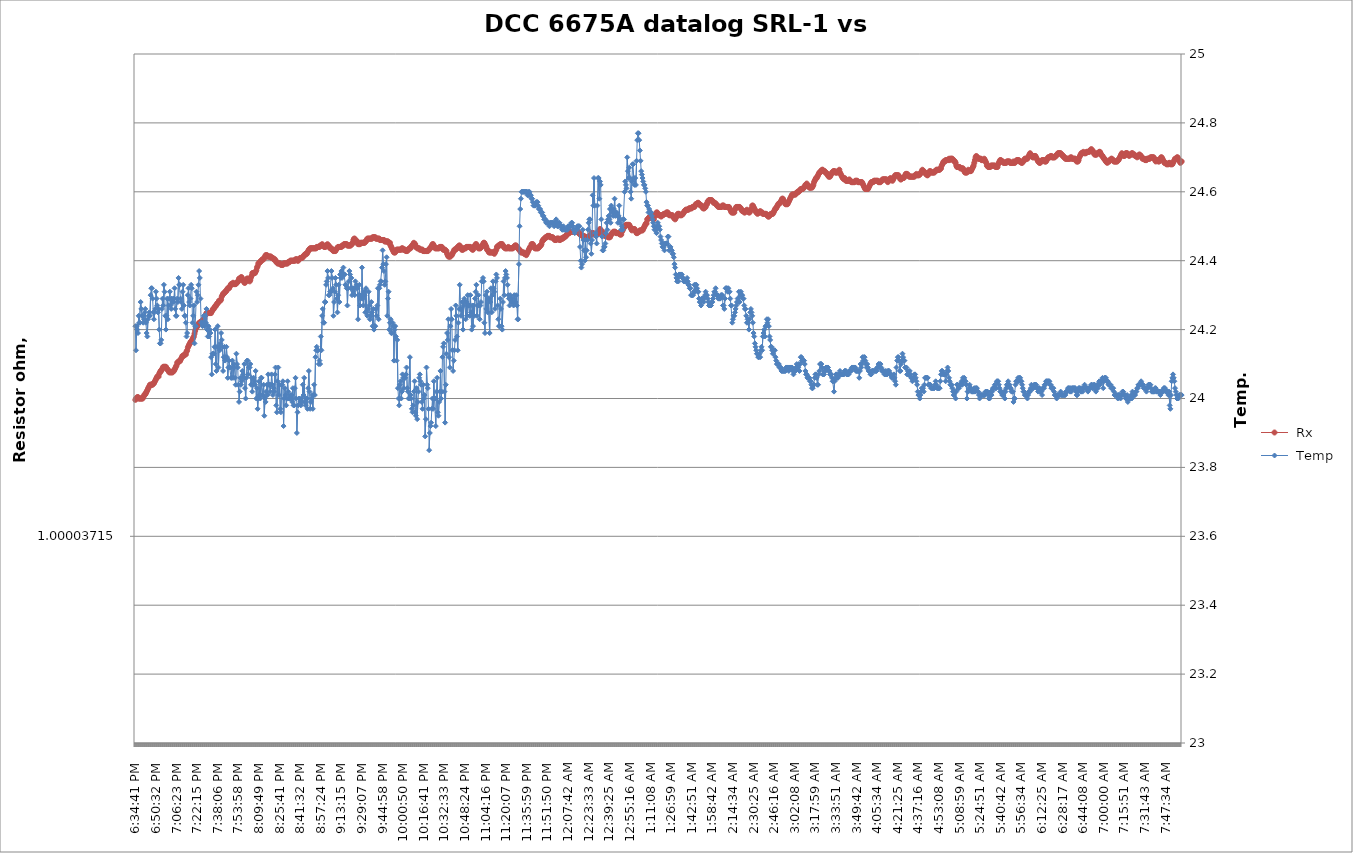
| Category |  Rx |
|---|---|
| 2021-03-14 18:34:41 | 1 |
| 2021-03-14 18:35:11 | 1 |
| 2021-03-14 18:35:42 | 1 |
| 2021-03-14 18:36:13 | 1 |
| 2021-03-14 18:36:43 | 1 |
| 2021-03-14 18:37:14 | 1 |
| 2021-03-14 18:37:45 | 1 |
| 2021-03-14 18:38:15 | 1 |
| 2021-03-14 18:38:46 | 1 |
| 2021-03-14 18:39:17 | 1 |
| 2021-03-14 18:39:47 | 1 |
| 2021-03-14 18:40:18 | 1 |
| 2021-03-14 18:40:49 | 1 |
| 2021-03-14 18:41:20 | 1 |
| 2021-03-14 18:41:50 | 1 |
| 2021-03-14 18:42:21 | 1 |
| 2021-03-14 18:42:52 | 1 |
| 2021-03-14 18:43:22 | 1 |
| 2021-03-14 18:43:53 | 1 |
| 2021-03-14 18:44:24 | 1 |
| 2021-03-14 18:44:54 | 1 |
| 2021-03-14 18:45:25 | 1 |
| 2021-03-14 18:45:56 | 1 |
| 2021-03-14 18:46:26 | 1 |
| 2021-03-14 18:46:57 | 1 |
| 2021-03-14 18:47:28 | 1 |
| 2021-03-14 18:47:59 | 1 |
| 2021-03-14 18:48:29 | 1 |
| 2021-03-14 18:49:00 | 1 |
| 2021-03-14 18:49:31 | 1 |
| 2021-03-14 18:50:01 | 1 |
| 2021-03-14 18:50:32 | 1 |
| 2021-03-14 18:51:03 | 1 |
| 2021-03-14 18:51:33 | 1 |
| 2021-03-14 18:52:04 | 1 |
| 2021-03-14 18:52:35 | 1 |
| 2021-03-14 18:53:05 | 1 |
| 2021-03-14 18:53:36 | 1 |
| 2021-03-14 18:54:07 | 1 |
| 2021-03-14 18:54:38 | 1 |
| 2021-03-14 18:55:08 | 1 |
| 2021-03-14 18:55:39 | 1 |
| 2021-03-14 18:56:10 | 1 |
| 2021-03-14 18:56:40 | 1 |
| 2021-03-14 18:57:11 | 1 |
| 2021-03-14 18:57:42 | 1 |
| 2021-03-14 18:58:12 | 1 |
| 2021-03-14 18:58:43 | 1 |
| 2021-03-14 18:59:14 | 1 |
| 2021-03-14 18:59:44 | 1 |
| 2021-03-14 19:00:15 | 1 |
| 2021-03-14 19:00:46 | 1 |
| 2021-03-14 19:01:17 | 1 |
| 2021-03-14 19:01:47 | 1 |
| 2021-03-14 19:02:18 | 1 |
| 2021-03-14 19:02:49 | 1 |
| 2021-03-14 19:03:19 | 1 |
| 2021-03-14 19:03:50 | 1 |
| 2021-03-14 19:04:21 | 1 |
| 2021-03-14 19:04:51 | 1 |
| 2021-03-14 19:05:22 | 1 |
| 2021-03-14 19:05:53 | 1 |
| 2021-03-14 19:06:23 | 1 |
| 2021-03-14 19:06:54 | 1 |
| 2021-03-14 19:07:25 | 1 |
| 2021-03-14 19:07:56 | 1 |
| 2021-03-14 19:08:26 | 1 |
| 2021-03-14 19:08:57 | 1 |
| 2021-03-14 19:09:28 | 1 |
| 2021-03-14 19:09:58 | 1 |
| 2021-03-14 19:10:29 | 1 |
| 2021-03-14 19:11:00 | 1 |
| 2021-03-14 19:11:30 | 1 |
| 2021-03-14 19:12:01 | 1 |
| 2021-03-14 19:12:32 | 1 |
| 2021-03-14 19:13:02 | 1 |
| 2021-03-14 19:13:33 | 1 |
| 2021-03-14 19:14:04 | 1 |
| 2021-03-14 19:14:35 | 1 |
| 2021-03-14 19:15:05 | 1 |
| 2021-03-14 19:15:36 | 1 |
| 2021-03-14 19:16:07 | 1 |
| 2021-03-14 19:16:37 | 1 |
| 2021-03-14 19:17:08 | 1 |
| 2021-03-14 19:17:39 | 1 |
| 2021-03-14 19:18:09 | 1 |
| 2021-03-14 19:18:40 | 1 |
| 2021-03-14 19:19:11 | 1 |
| 2021-03-14 19:19:41 | 1 |
| 2021-03-14 19:20:12 | 1 |
| 2021-03-14 19:20:43 | 1 |
| 2021-03-14 19:21:14 | 1 |
| 2021-03-14 19:21:44 | 1 |
| 2021-03-14 19:22:15 | 1 |
| 2021-03-14 19:22:46 | 1 |
| 2021-03-14 19:23:16 | 1 |
| 2021-03-14 19:23:47 | 1 |
| 2021-03-14 19:24:18 | 1 |
| 2021-03-14 19:24:48 | 1 |
| 2021-03-14 19:25:19 | 1 |
| 2021-03-14 19:25:50 | 1 |
| 2021-03-14 19:26:20 | 1 |
| 2021-03-14 19:26:51 | 1 |
| 2021-03-14 19:27:22 | 1 |
| 2021-03-14 19:27:53 | 1 |
| 2021-03-14 19:28:23 | 1 |
| 2021-03-14 19:28:54 | 1 |
| 2021-03-14 19:29:25 | 1 |
| 2021-03-14 19:29:55 | 1 |
| 2021-03-14 19:30:26 | 1 |
| 2021-03-14 19:30:57 | 1 |
| 2021-03-14 19:31:27 | 1 |
| 2021-03-14 19:31:58 | 1 |
| 2021-03-14 19:32:29 | 1 |
| 2021-03-14 19:32:59 | 1 |
| 2021-03-14 19:33:30 | 1 |
| 2021-03-14 19:34:01 | 1 |
| 2021-03-14 19:34:32 | 1 |
| 2021-03-14 19:35:02 | 1 |
| 2021-03-14 19:35:33 | 1 |
| 2021-03-14 19:36:04 | 1 |
| 2021-03-14 19:36:34 | 1 |
| 2021-03-14 19:37:05 | 1 |
| 2021-03-14 19:37:36 | 1 |
| 2021-03-14 19:38:06 | 1 |
| 2021-03-14 19:38:37 | 1 |
| 2021-03-14 19:39:08 | 1 |
| 2021-03-14 19:39:38 | 1 |
| 2021-03-14 19:40:09 | 1 |
| 2021-03-14 19:40:40 | 1 |
| 2021-03-14 19:41:11 | 1 |
| 2021-03-14 19:41:41 | 1 |
| 2021-03-14 19:42:12 | 1 |
| 2021-03-14 19:42:43 | 1 |
| 2021-03-14 19:43:13 | 1 |
| 2021-03-14 19:43:44 | 1 |
| 2021-03-14 19:44:15 | 1 |
| 2021-03-14 19:44:45 | 1 |
| 2021-03-14 19:45:16 | 1 |
| 2021-03-14 19:45:47 | 1 |
| 2021-03-14 19:46:17 | 1 |
| 2021-03-14 19:46:48 | 1 |
| 2021-03-14 19:47:19 | 1 |
| 2021-03-14 19:47:50 | 1 |
| 2021-03-14 19:48:20 | 1 |
| 2021-03-14 19:48:51 | 1 |
| 2021-03-14 19:49:22 | 1 |
| 2021-03-14 19:49:52 | 1 |
| 2021-03-14 19:50:23 | 1 |
| 2021-03-14 19:50:54 | 1 |
| 2021-03-14 19:51:24 | 1 |
| 2021-03-14 19:51:55 | 1 |
| 2021-03-14 19:52:26 | 1 |
| 2021-03-14 19:52:56 | 1 |
| 2021-03-14 19:53:27 | 1 |
| 2021-03-14 19:53:58 | 1 |
| 2021-03-14 19:54:29 | 1 |
| 2021-03-14 19:54:59 | 1 |
| 2021-03-14 19:55:30 | 1 |
| 2021-03-14 19:56:01 | 1 |
| 2021-03-14 19:56:31 | 1 |
| 2021-03-14 19:57:02 | 1 |
| 2021-03-14 19:57:33 | 1 |
| 2021-03-14 19:58:03 | 1 |
| 2021-03-14 19:58:34 | 1 |
| 2021-03-14 19:59:05 | 1 |
| 2021-03-14 19:59:36 | 1 |
| 2021-03-14 20:00:06 | 1 |
| 2021-03-14 20:00:37 | 1 |
| 2021-03-14 20:01:08 | 1 |
| 2021-03-14 20:01:38 | 1 |
| 2021-03-14 20:02:09 | 1 |
| 2021-03-14 20:02:40 | 1 |
| 2021-03-14 20:03:10 | 1 |
| 2021-03-14 20:03:41 | 1 |
| 2021-03-14 20:04:12 | 1 |
| 2021-03-14 20:04:42 | 1 |
| 2021-03-14 20:05:13 | 1 |
| 2021-03-14 20:05:44 | 1 |
| 2021-03-14 20:06:15 | 1 |
| 2021-03-14 20:06:45 | 1 |
| 2021-03-14 20:07:16 | 1 |
| 2021-03-14 20:07:47 | 1 |
| 2021-03-14 20:08:17 | 1 |
| 2021-03-14 20:08:48 | 1 |
| 2021-03-14 20:09:19 | 1 |
| 2021-03-14 20:09:49 | 1 |
| 2021-03-14 20:10:20 | 1 |
| 2021-03-14 20:10:51 | 1 |
| 2021-03-14 20:11:21 | 1 |
| 2021-03-14 20:11:52 | 1 |
| 2021-03-14 20:12:23 | 1 |
| 2021-03-14 20:12:54 | 1 |
| 2021-03-14 20:13:24 | 1 |
| 2021-03-14 20:13:55 | 1 |
| 2021-03-14 20:14:26 | 1 |
| 2021-03-14 20:14:56 | 1 |
| 2021-03-14 20:15:27 | 1 |
| 2021-03-14 20:15:58 | 1 |
| 2021-03-14 20:16:28 | 1 |
| 2021-03-14 20:16:59 | 1 |
| 2021-03-14 20:17:30 | 1 |
| 2021-03-14 20:18:00 | 1 |
| 2021-03-14 20:18:31 | 1 |
| 2021-03-14 20:19:02 | 1 |
| 2021-03-14 20:19:33 | 1 |
| 2021-03-14 20:20:03 | 1 |
| 2021-03-14 20:20:34 | 1 |
| 2021-03-14 20:21:05 | 1 |
| 2021-03-14 20:21:35 | 1 |
| 2021-03-14 20:22:06 | 1 |
| 2021-03-14 20:22:37 | 1 |
| 2021-03-14 20:23:07 | 1 |
| 2021-03-14 20:23:38 | 1 |
| 2021-03-14 20:24:09 | 1 |
| 2021-03-14 20:24:39 | 1 |
| 2021-03-14 20:25:10 | 1 |
| 2021-03-14 20:25:41 | 1 |
| 2021-03-14 20:26:11 | 1 |
| 2021-03-14 20:26:42 | 1 |
| 2021-03-14 20:27:13 | 1 |
| 2021-03-14 20:27:44 | 1 |
| 2021-03-14 20:28:14 | 1 |
| 2021-03-14 20:28:45 | 1 |
| 2021-03-14 20:29:16 | 1 |
| 2021-03-14 20:29:46 | 1 |
| 2021-03-14 20:30:17 | 1 |
| 2021-03-14 20:30:48 | 1 |
| 2021-03-14 20:31:18 | 1 |
| 2021-03-14 20:31:49 | 1 |
| 2021-03-14 20:32:20 | 1 |
| 2021-03-14 20:32:50 | 1 |
| 2021-03-14 20:33:21 | 1 |
| 2021-03-14 20:33:52 | 1 |
| 2021-03-14 20:34:23 | 1 |
| 2021-03-14 20:34:53 | 1 |
| 2021-03-14 20:35:24 | 1 |
| 2021-03-14 20:35:55 | 1 |
| 2021-03-14 20:36:25 | 1 |
| 2021-03-14 20:36:56 | 1 |
| 2021-03-14 20:37:27 | 1 |
| 2021-03-14 20:37:57 | 1 |
| 2021-03-14 20:38:28 | 1 |
| 2021-03-14 20:38:59 | 1 |
| 2021-03-14 20:39:29 | 1 |
| 2021-03-14 20:40:00 | 1 |
| 2021-03-14 20:40:31 | 1 |
| 2021-03-14 20:41:02 | 1 |
| 2021-03-14 20:41:32 | 1 |
| 2021-03-14 20:42:03 | 1 |
| 2021-03-14 20:42:34 | 1 |
| 2021-03-14 20:43:04 | 1 |
| 2021-03-14 20:43:35 | 1 |
| 2021-03-14 20:44:06 | 1 |
| 2021-03-14 20:44:36 | 1 |
| 2021-03-14 20:45:07 | 1 |
| 2021-03-14 20:45:38 | 1 |
| 2021-03-14 20:46:08 | 1 |
| 2021-03-14 20:46:39 | 1 |
| 2021-03-14 20:47:10 | 1 |
| 2021-03-14 20:47:41 | 1 |
| 2021-03-14 20:48:11 | 1 |
| 2021-03-14 20:48:42 | 1 |
| 2021-03-14 20:49:13 | 1 |
| 2021-03-14 20:49:43 | 1 |
| 2021-03-14 20:50:14 | 1 |
| 2021-03-14 20:50:45 | 1 |
| 2021-03-14 20:51:15 | 1 |
| 2021-03-14 20:51:46 | 1 |
| 2021-03-14 20:52:17 | 1 |
| 2021-03-14 20:52:47 | 1 |
| 2021-03-14 20:53:18 | 1 |
| 2021-03-14 20:53:49 | 1 |
| 2021-03-14 20:54:20 | 1 |
| 2021-03-14 20:54:50 | 1 |
| 2021-03-14 20:55:21 | 1 |
| 2021-03-14 20:55:52 | 1 |
| 2021-03-14 20:56:22 | 1 |
| 2021-03-14 20:56:53 | 1 |
| 2021-03-14 20:57:24 | 1 |
| 2021-03-14 20:57:54 | 1 |
| 2021-03-14 20:58:25 | 1 |
| 2021-03-14 20:58:56 | 1 |
| 2021-03-14 20:59:26 | 1 |
| 2021-03-14 20:59:57 | 1 |
| 2021-03-14 21:00:28 | 1 |
| 2021-03-14 21:00:59 | 1 |
| 2021-03-14 21:01:29 | 1 |
| 2021-03-14 21:02:00 | 1 |
| 2021-03-14 21:02:31 | 1 |
| 2021-03-14 21:03:01 | 1 |
| 2021-03-14 21:03:32 | 1 |
| 2021-03-14 21:04:03 | 1 |
| 2021-03-14 21:04:33 | 1 |
| 2021-03-14 21:05:04 | 1 |
| 2021-03-14 21:05:35 | 1 |
| 2021-03-14 21:06:05 | 1 |
| 2021-03-14 21:06:36 | 1 |
| 2021-03-14 21:07:07 | 1 |
| 2021-03-14 21:07:38 | 1 |
| 2021-03-14 21:08:08 | 1 |
| 2021-03-14 21:08:39 | 1 |
| 2021-03-14 21:09:10 | 1 |
| 2021-03-14 21:09:40 | 1 |
| 2021-03-14 21:10:11 | 1 |
| 2021-03-14 21:10:42 | 1 |
| 2021-03-14 21:11:12 | 1 |
| 2021-03-14 21:11:43 | 1 |
| 2021-03-14 21:12:14 | 1 |
| 2021-03-14 21:12:45 | 1 |
| 2021-03-14 21:13:15 | 1 |
| 2021-03-14 21:13:46 | 1 |
| 2021-03-14 21:14:17 | 1 |
| 2021-03-14 21:14:47 | 1 |
| 2021-03-14 21:15:18 | 1 |
| 2021-03-14 21:15:49 | 1 |
| 2021-03-14 21:16:19 | 1 |
| 2021-03-14 21:16:50 | 1 |
| 2021-03-14 21:17:21 | 1 |
| 2021-03-14 21:17:51 | 1 |
| 2021-03-14 21:18:22 | 1 |
| 2021-03-14 21:18:53 | 1 |
| 2021-03-14 21:19:24 | 1 |
| 2021-03-14 21:19:54 | 1 |
| 2021-03-14 21:20:25 | 1 |
| 2021-03-14 21:20:56 | 1 |
| 2021-03-14 21:21:26 | 1 |
| 2021-03-14 21:21:57 | 1 |
| 2021-03-14 21:22:28 | 1 |
| 2021-03-14 21:22:58 | 1 |
| 2021-03-14 21:23:29 | 1 |
| 2021-03-14 21:24:00 | 1 |
| 2021-03-14 21:24:30 | 1 |
| 2021-03-14 21:25:01 | 1 |
| 2021-03-14 21:25:32 | 1 |
| 2021-03-14 21:26:03 | 1 |
| 2021-03-14 21:26:33 | 1 |
| 2021-03-14 21:27:04 | 1 |
| 2021-03-14 21:27:35 | 1 |
| 2021-03-14 21:28:05 | 1 |
| 2021-03-14 21:28:36 | 1 |
| 2021-03-14 21:29:07 | 1 |
| 2021-03-14 21:29:37 | 1 |
| 2021-03-14 21:30:08 | 1 |
| 2021-03-14 21:30:39 | 1 |
| 2021-03-14 21:31:09 | 1 |
| 2021-03-14 21:31:40 | 1 |
| 2021-03-14 21:32:11 | 1 |
| 2021-03-14 21:32:42 | 1 |
| 2021-03-14 21:33:12 | 1 |
| 2021-03-14 21:33:43 | 1 |
| 2021-03-14 21:34:14 | 1 |
| 2021-03-14 21:34:44 | 1 |
| 2021-03-14 21:35:15 | 1 |
| 2021-03-14 21:35:46 | 1 |
| 2021-03-14 21:36:16 | 1 |
| 2021-03-14 21:36:47 | 1 |
| 2021-03-14 21:37:18 | 1 |
| 2021-03-14 21:37:49 | 1 |
| 2021-03-14 21:38:19 | 1 |
| 2021-03-14 21:38:50 | 1 |
| 2021-03-14 21:39:21 | 1 |
| 2021-03-14 21:39:51 | 1 |
| 2021-03-14 21:40:22 | 1 |
| 2021-03-14 21:40:53 | 1 |
| 2021-03-14 21:41:23 | 1 |
| 2021-03-14 21:41:54 | 1 |
| 2021-03-14 21:42:25 | 1 |
| 2021-03-14 21:42:55 | 1 |
| 2021-03-14 21:43:26 | 1 |
| 2021-03-14 21:43:57 | 1 |
| 2021-03-14 21:44:28 | 1 |
| 2021-03-14 21:44:58 | 1 |
| 2021-03-14 21:45:29 | 1 |
| 2021-03-14 21:46:00 | 1 |
| 2021-03-14 21:46:30 | 1 |
| 2021-03-14 21:47:01 | 1 |
| 2021-03-14 21:47:32 | 1 |
| 2021-03-14 21:48:02 | 1 |
| 2021-03-14 21:48:33 | 1 |
| 2021-03-14 21:49:04 | 1 |
| 2021-03-14 21:49:34 | 1 |
| 2021-03-14 21:50:05 | 1 |
| 2021-03-14 21:50:36 | 1 |
| 2021-03-14 21:51:07 | 1 |
| 2021-03-14 21:51:37 | 1 |
| 2021-03-14 21:52:08 | 1 |
| 2021-03-14 21:52:39 | 1 |
| 2021-03-14 21:53:09 | 1 |
| 2021-03-14 21:53:40 | 1 |
| 2021-03-14 21:54:11 | 1 |
| 2021-03-14 21:54:41 | 1 |
| 2021-03-14 21:55:12 | 1 |
| 2021-03-14 21:55:43 | 1 |
| 2021-03-14 21:56:14 | 1 |
| 2021-03-14 21:56:44 | 1 |
| 2021-03-14 21:57:15 | 1 |
| 2021-03-14 21:57:46 | 1 |
| 2021-03-14 21:58:16 | 1 |
| 2021-03-14 21:58:47 | 1 |
| 2021-03-14 21:59:18 | 1 |
| 2021-03-14 21:59:48 | 1 |
| 2021-03-14 22:00:19 | 1 |
| 2021-03-14 22:00:50 | 1 |
| 2021-03-14 22:01:20 | 1 |
| 2021-03-14 22:01:51 | 1 |
| 2021-03-14 22:02:22 | 1 |
| 2021-03-14 22:02:53 | 1 |
| 2021-03-14 22:03:23 | 1 |
| 2021-03-14 22:03:54 | 1 |
| 2021-03-14 22:04:25 | 1 |
| 2021-03-14 22:04:55 | 1 |
| 2021-03-14 22:05:26 | 1 |
| 2021-03-14 22:05:57 | 1 |
| 2021-03-14 22:06:27 | 1 |
| 2021-03-14 22:06:58 | 1 |
| 2021-03-14 22:07:29 | 1 |
| 2021-03-14 22:07:59 | 1 |
| 2021-03-14 22:08:30 | 1 |
| 2021-03-14 22:09:01 | 1 |
| 2021-03-14 22:09:32 | 1 |
| 2021-03-14 22:10:02 | 1 |
| 2021-03-14 22:10:33 | 1 |
| 2021-03-14 22:11:04 | 1 |
| 2021-03-14 22:11:34 | 1 |
| 2021-03-14 22:12:05 | 1 |
| 2021-03-14 22:12:36 | 1 |
| 2021-03-14 22:13:06 | 1 |
| 2021-03-14 22:13:37 | 1 |
| 2021-03-14 22:14:08 | 1 |
| 2021-03-14 22:14:38 | 1 |
| 2021-03-14 22:15:09 | 1 |
| 2021-03-14 22:15:40 | 1 |
| 2021-03-14 22:16:11 | 1 |
| 2021-03-14 22:16:41 | 1 |
| 2021-03-14 22:17:12 | 1 |
| 2021-03-14 22:17:43 | 1 |
| 2021-03-14 22:18:13 | 1 |
| 2021-03-14 22:18:44 | 1 |
| 2021-03-14 22:19:15 | 1 |
| 2021-03-14 22:19:45 | 1 |
| 2021-03-14 22:20:16 | 1 |
| 2021-03-14 22:20:47 | 1 |
| 2021-03-14 22:21:18 | 1 |
| 2021-03-14 22:21:48 | 1 |
| 2021-03-14 22:22:19 | 1 |
| 2021-03-14 22:22:50 | 1 |
| 2021-03-14 22:23:20 | 1 |
| 2021-03-14 22:23:51 | 1 |
| 2021-03-14 22:24:22 | 1 |
| 2021-03-14 22:24:52 | 1 |
| 2021-03-14 22:25:23 | 1 |
| 2021-03-14 22:25:54 | 1 |
| 2021-03-14 22:26:24 | 1 |
| 2021-03-14 22:26:55 | 1 |
| 2021-03-14 22:27:26 | 1 |
| 2021-03-14 22:27:56 | 1 |
| 2021-03-14 22:28:27 | 1 |
| 2021-03-14 22:28:58 | 1 |
| 2021-03-14 22:29:29 | 1 |
| 2021-03-14 22:29:59 | 1 |
| 2021-03-14 22:30:30 | 1 |
| 2021-03-14 22:31:01 | 1 |
| 2021-03-14 22:31:31 | 1 |
| 2021-03-14 22:32:02 | 1 |
| 2021-03-14 22:32:33 | 1 |
| 2021-03-14 22:33:03 | 1 |
| 2021-03-14 22:33:34 | 1 |
| 2021-03-14 22:34:05 | 1 |
| 2021-03-14 22:34:35 | 1 |
| 2021-03-14 22:35:06 | 1 |
| 2021-03-14 22:35:37 | 1 |
| 2021-03-14 22:36:08 | 1 |
| 2021-03-14 22:36:38 | 1 |
| 2021-03-14 22:37:09 | 1 |
| 2021-03-14 22:37:40 | 1 |
| 2021-03-14 22:38:10 | 1 |
| 2021-03-14 22:38:41 | 1 |
| 2021-03-14 22:39:12 | 1 |
| 2021-03-14 22:39:42 | 1 |
| 2021-03-14 22:40:13 | 1 |
| 2021-03-14 22:40:44 | 1 |
| 2021-03-14 22:41:14 | 1 |
| 2021-03-14 22:41:45 | 1 |
| 2021-03-14 22:42:16 | 1 |
| 2021-03-14 22:42:47 | 1 |
| 2021-03-14 22:43:17 | 1 |
| 2021-03-14 22:43:48 | 1 |
| 2021-03-14 22:44:19 | 1 |
| 2021-03-14 22:44:49 | 1 |
| 2021-03-14 22:45:20 | 1 |
| 2021-03-14 22:45:51 | 1 |
| 2021-03-14 22:46:21 | 1 |
| 2021-03-14 22:46:52 | 1 |
| 2021-03-14 22:47:23 | 1 |
| 2021-03-14 22:47:53 | 1 |
| 2021-03-14 22:48:24 | 1 |
| 2021-03-14 22:48:55 | 1 |
| 2021-03-14 22:49:26 | 1 |
| 2021-03-14 22:49:56 | 1 |
| 2021-03-14 22:50:27 | 1 |
| 2021-03-14 22:50:58 | 1 |
| 2021-03-14 22:51:28 | 1 |
| 2021-03-14 22:51:59 | 1 |
| 2021-03-14 22:52:30 | 1 |
| 2021-03-14 22:53:00 | 1 |
| 2021-03-14 22:53:31 | 1 |
| 2021-03-14 22:54:02 | 1 |
| 2021-03-14 22:54:32 | 1 |
| 2021-03-14 22:55:03 | 1 |
| 2021-03-14 22:55:34 | 1 |
| 2021-03-14 22:56:05 | 1 |
| 2021-03-14 22:56:35 | 1 |
| 2021-03-14 22:57:06 | 1 |
| 2021-03-14 22:57:37 | 1 |
| 2021-03-14 22:58:07 | 1 |
| 2021-03-14 22:58:38 | 1 |
| 2021-03-14 22:59:09 | 1 |
| 2021-03-14 22:59:39 | 1 |
| 2021-03-14 23:00:10 | 1 |
| 2021-03-14 23:00:41 | 1 |
| 2021-03-14 23:01:11 | 1 |
| 2021-03-14 23:01:42 | 1 |
| 2021-03-14 23:02:13 | 1 |
| 2021-03-14 23:02:44 | 1 |
| 2021-03-14 23:03:14 | 1 |
| 2021-03-14 23:03:45 | 1 |
| 2021-03-14 23:04:16 | 1 |
| 2021-03-14 23:04:46 | 1 |
| 2021-03-14 23:05:17 | 1 |
| 2021-03-14 23:05:48 | 1 |
| 2021-03-14 23:06:18 | 1 |
| 2021-03-14 23:06:49 | 1 |
| 2021-03-14 23:07:20 | 1 |
| 2021-03-14 23:07:51 | 1 |
| 2021-03-14 23:08:21 | 1 |
| 2021-03-14 23:08:52 | 1 |
| 2021-03-14 23:09:23 | 1 |
| 2021-03-14 23:09:53 | 1 |
| 2021-03-14 23:10:24 | 1 |
| 2021-03-14 23:10:55 | 1 |
| 2021-03-14 23:11:25 | 1 |
| 2021-03-14 23:11:56 | 1 |
| 2021-03-14 23:12:27 | 1 |
| 2021-03-14 23:12:57 | 1 |
| 2021-03-14 23:13:28 | 1 |
| 2021-03-14 23:13:59 | 1 |
| 2021-03-14 23:14:30 | 1 |
| 2021-03-14 23:15:00 | 1 |
| 2021-03-14 23:15:31 | 1 |
| 2021-03-14 23:16:02 | 1 |
| 2021-03-14 23:16:32 | 1 |
| 2021-03-14 23:17:03 | 1 |
| 2021-03-14 23:17:34 | 1 |
| 2021-03-14 23:18:04 | 1 |
| 2021-03-14 23:18:35 | 1 |
| 2021-03-14 23:19:06 | 1 |
| 2021-03-14 23:19:36 | 1 |
| 2021-03-14 23:20:07 | 1 |
| 2021-03-14 23:20:38 | 1 |
| 2021-03-14 23:21:08 | 1 |
| 2021-03-14 23:21:39 | 1 |
| 2021-03-14 23:22:10 | 1 |
| 2021-03-14 23:22:41 | 1 |
| 2021-03-14 23:23:11 | 1 |
| 2021-03-14 23:23:42 | 1 |
| 2021-03-14 23:24:13 | 1 |
| 2021-03-14 23:24:43 | 1 |
| 2021-03-14 23:25:14 | 1 |
| 2021-03-14 23:25:45 | 1 |
| 2021-03-14 23:26:15 | 1 |
| 2021-03-14 23:26:46 | 1 |
| 2021-03-14 23:27:17 | 1 |
| 2021-03-14 23:27:47 | 1 |
| 2021-03-14 23:28:18 | 1 |
| 2021-03-14 23:28:49 | 1 |
| 2021-03-14 23:29:20 | 1 |
| 2021-03-14 23:29:50 | 1 |
| 2021-03-14 23:30:21 | 1 |
| 2021-03-14 23:30:52 | 1 |
| 2021-03-14 23:31:22 | 1 |
| 2021-03-14 23:31:53 | 1 |
| 2021-03-14 23:32:24 | 1 |
| 2021-03-14 23:32:54 | 1 |
| 2021-03-14 23:33:25 | 1 |
| 2021-03-14 23:33:56 | 1 |
| 2021-03-14 23:34:26 | 1 |
| 2021-03-14 23:34:57 | 1 |
| 2021-03-14 23:35:28 | 1 |
| 2021-03-14 23:35:59 | 1 |
| 2021-03-14 23:36:29 | 1 |
| 2021-03-14 23:37:00 | 1 |
| 2021-03-14 23:37:31 | 1 |
| 2021-03-14 23:38:01 | 1 |
| 2021-03-14 23:38:32 | 1 |
| 2021-03-14 23:39:03 | 1 |
| 2021-03-14 23:39:33 | 1 |
| 2021-03-14 23:40:04 | 1 |
| 2021-03-14 23:40:35 | 1 |
| 2021-03-14 23:41:06 | 1 |
| 2021-03-14 23:41:36 | 1 |
| 2021-03-14 23:42:07 | 1 |
| 2021-03-14 23:42:38 | 1 |
| 2021-03-14 23:43:08 | 1 |
| 2021-03-14 23:43:39 | 1 |
| 2021-03-14 23:44:10 | 1 |
| 2021-03-14 23:44:40 | 1 |
| 2021-03-14 23:45:11 | 1 |
| 2021-03-14 23:45:42 | 1 |
| 2021-03-14 23:46:12 | 1 |
| 2021-03-14 23:46:43 | 1 |
| 2021-03-14 23:47:14 | 1 |
| 2021-03-14 23:47:45 | 1 |
| 2021-03-14 23:48:15 | 1 |
| 2021-03-14 23:48:46 | 1 |
| 2021-03-14 23:49:17 | 1 |
| 2021-03-14 23:49:47 | 1 |
| 2021-03-14 23:50:18 | 1 |
| 2021-03-14 23:50:49 | 1 |
| 2021-03-14 23:51:19 | 1 |
| 2021-03-14 23:51:50 | 1 |
| 2021-03-14 23:52:21 | 1 |
| 2021-03-14 23:52:52 | 1 |
| 2021-03-14 23:53:22 | 1 |
| 2021-03-14 23:53:53 | 1 |
| 2021-03-14 23:54:24 | 1 |
| 2021-03-14 23:54:54 | 1 |
| 2021-03-14 23:55:25 | 1 |
| 2021-03-14 23:55:56 | 1 |
| 2021-03-14 23:56:26 | 1 |
| 2021-03-14 23:56:57 | 1 |
| 2021-03-14 23:57:28 | 1 |
| 2021-03-14 23:57:58 | 1 |
| 2021-03-14 23:58:29 | 1 |
| 2021-03-14 23:59:00 | 1 |
| 2021-03-14 23:59:31 | 1 |
| 2021-03-15 00:00:01 | 1 |
| 2021-03-15 00:00:32 | 1 |
| 2021-03-15 00:01:03 | 1 |
| 2021-03-15 00:01:33 | 1 |
| 2021-03-15 00:02:04 | 1 |
| 2021-03-15 00:02:35 | 1 |
| 2021-03-15 00:03:05 | 1 |
| 2021-03-15 00:03:36 | 1 |
| 2021-03-15 00:04:07 | 1 |
| 2021-03-15 00:04:38 | 1 |
| 2021-03-15 00:05:08 | 1 |
| 2021-03-15 00:05:39 | 1 |
| 2021-03-15 00:06:10 | 1 |
| 2021-03-15 00:06:40 | 1 |
| 2021-03-15 00:07:11 | 1 |
| 2021-03-15 00:07:42 | 1 |
| 2021-03-15 00:08:12 | 1 |
| 2021-03-15 00:08:43 | 1 |
| 2021-03-15 00:09:14 | 1 |
| 2021-03-15 00:09:44 | 1 |
| 2021-03-15 00:10:15 | 1 |
| 2021-03-15 00:10:46 | 1 |
| 2021-03-15 00:11:17 | 1 |
| 2021-03-15 00:11:47 | 1 |
| 2021-03-15 00:12:18 | 1 |
| 2021-03-15 00:12:49 | 1 |
| 2021-03-15 00:13:19 | 1 |
| 2021-03-15 00:13:50 | 1 |
| 2021-03-15 00:14:21 | 1 |
| 2021-03-15 00:14:51 | 1 |
| 2021-03-15 00:15:22 | 1 |
| 2021-03-15 00:15:53 | 1 |
| 2021-03-15 00:16:23 | 1 |
| 2021-03-15 00:16:54 | 1 |
| 2021-03-15 00:17:25 | 1 |
| 2021-03-15 00:17:56 | 1 |
| 2021-03-15 00:18:26 | 1 |
| 2021-03-15 00:18:57 | 1 |
| 2021-03-15 00:19:28 | 1 |
| 2021-03-15 00:19:58 | 1 |
| 2021-03-15 00:20:29 | 1 |
| 2021-03-15 00:21:00 | 1 |
| 2021-03-15 00:21:30 | 1 |
| 2021-03-15 00:22:01 | 1 |
| 2021-03-15 00:22:32 | 1 |
| 2021-03-15 00:23:03 | 1 |
| 2021-03-15 00:23:33 | 1 |
| 2021-03-15 00:24:04 | 1 |
| 2021-03-15 00:24:35 | 1 |
| 2021-03-15 00:25:05 | 1 |
| 2021-03-15 00:25:36 | 1 |
| 2021-03-15 00:26:07 | 1 |
| 2021-03-15 00:26:37 | 1 |
| 2021-03-15 00:27:08 | 1 |
| 2021-03-15 00:27:39 | 1 |
| 2021-03-15 00:28:10 | 1 |
| 2021-03-15 00:28:40 | 1 |
| 2021-03-15 00:29:11 | 1 |
| 2021-03-15 00:29:42 | 1 |
| 2021-03-15 00:30:12 | 1 |
| 2021-03-15 00:30:43 | 1 |
| 2021-03-15 00:31:14 | 1 |
| 2021-03-15 00:31:44 | 1 |
| 2021-03-15 00:32:15 | 1 |
| 2021-03-15 00:32:46 | 1 |
| 2021-03-15 00:33:16 | 1 |
| 2021-03-15 00:33:47 | 1 |
| 2021-03-15 00:34:18 | 1 |
| 2021-03-15 00:34:49 | 1 |
| 2021-03-15 00:35:19 | 1 |
| 2021-03-15 00:35:50 | 1 |
| 2021-03-15 00:36:21 | 1 |
| 2021-03-15 00:36:51 | 1 |
| 2021-03-15 00:37:22 | 1 |
| 2021-03-15 00:37:53 | 1 |
| 2021-03-15 00:38:23 | 1 |
| 2021-03-15 00:38:54 | 1 |
| 2021-03-15 00:39:25 | 1 |
| 2021-03-15 00:39:56 | 1 |
| 2021-03-15 00:40:26 | 1 |
| 2021-03-15 00:40:57 | 1 |
| 2021-03-15 00:41:28 | 1 |
| 2021-03-15 00:41:58 | 1 |
| 2021-03-15 00:42:29 | 1 |
| 2021-03-15 00:43:00 | 1 |
| 2021-03-15 00:43:30 | 1 |
| 2021-03-15 00:44:01 | 1 |
| 2021-03-15 00:44:32 | 1 |
| 2021-03-15 00:45:03 | 1 |
| 2021-03-15 00:45:33 | 1 |
| 2021-03-15 00:46:04 | 1 |
| 2021-03-15 00:46:35 | 1 |
| 2021-03-15 00:47:05 | 1 |
| 2021-03-15 00:47:36 | 1 |
| 2021-03-15 00:48:07 | 1 |
| 2021-03-15 00:48:37 | 1 |
| 2021-03-15 00:49:08 | 1 |
| 2021-03-15 00:49:39 | 1 |
| 2021-03-15 00:50:09 | 1 |
| 2021-03-15 00:50:40 | 1 |
| 2021-03-15 00:51:11 | 1 |
| 2021-03-15 00:51:42 | 1 |
| 2021-03-15 00:52:12 | 1 |
| 2021-03-15 00:52:43 | 1 |
| 2021-03-15 00:53:14 | 1 |
| 2021-03-15 00:53:44 | 1 |
| 2021-03-15 00:54:15 | 1 |
| 2021-03-15 00:54:46 | 1 |
| 2021-03-15 00:55:16 | 1 |
| 2021-03-15 00:55:47 | 1 |
| 2021-03-15 00:56:18 | 1 |
| 2021-03-15 00:56:49 | 1 |
| 2021-03-15 00:57:19 | 1 |
| 2021-03-15 00:57:50 | 1 |
| 2021-03-15 00:58:21 | 1 |
| 2021-03-15 00:58:51 | 1 |
| 2021-03-15 00:59:22 | 1 |
| 2021-03-15 00:59:53 | 1 |
| 2021-03-15 01:00:23 | 1 |
| 2021-03-15 01:00:54 | 1 |
| 2021-03-15 01:01:25 | 1 |
| 2021-03-15 01:01:56 | 1 |
| 2021-03-15 01:02:26 | 1 |
| 2021-03-15 01:02:57 | 1 |
| 2021-03-15 01:03:28 | 1 |
| 2021-03-15 01:03:58 | 1 |
| 2021-03-15 01:04:29 | 1 |
| 2021-03-15 01:05:00 | 1 |
| 2021-03-15 01:05:30 | 1 |
| 2021-03-15 01:06:01 | 1 |
| 2021-03-15 01:06:32 | 1 |
| 2021-03-15 01:07:02 | 1 |
| 2021-03-15 01:07:33 | 1 |
| 2021-03-15 01:08:04 | 1 |
| 2021-03-15 01:08:34 | 1 |
| 2021-03-15 01:09:05 | 1 |
| 2021-03-15 01:09:36 | 1 |
| 2021-03-15 01:10:07 | 1 |
| 2021-03-15 01:10:37 | 1 |
| 2021-03-15 01:11:08 | 1 |
| 2021-03-15 01:11:39 | 1 |
| 2021-03-15 01:12:09 | 1 |
| 2021-03-15 01:12:40 | 1 |
| 2021-03-15 01:13:11 | 1 |
| 2021-03-15 01:13:41 | 1 |
| 2021-03-15 01:14:12 | 1 |
| 2021-03-15 01:14:43 | 1 |
| 2021-03-15 01:15:14 | 1 |
| 2021-03-15 01:15:44 | 1 |
| 2021-03-15 01:16:15 | 1 |
| 2021-03-15 01:16:46 | 1 |
| 2021-03-15 01:17:16 | 1 |
| 2021-03-15 01:17:47 | 1 |
| 2021-03-15 01:18:18 | 1 |
| 2021-03-15 01:18:48 | 1 |
| 2021-03-15 01:19:19 | 1 |
| 2021-03-15 01:19:50 | 1 |
| 2021-03-15 01:20:20 | 1 |
| 2021-03-15 01:20:51 | 1 |
| 2021-03-15 01:21:22 | 1 |
| 2021-03-15 01:21:53 | 1 |
| 2021-03-15 01:22:23 | 1 |
| 2021-03-15 01:22:54 | 1 |
| 2021-03-15 01:23:25 | 1 |
| 2021-03-15 01:23:55 | 1 |
| 2021-03-15 01:24:26 | 1 |
| 2021-03-15 01:24:57 | 1 |
| 2021-03-15 01:25:27 | 1 |
| 2021-03-15 01:25:58 | 1 |
| 2021-03-15 01:26:29 | 1 |
| 2021-03-15 01:26:59 | 1 |
| 2021-03-15 01:27:30 | 1 |
| 2021-03-15 01:28:01 | 1 |
| 2021-03-15 01:28:32 | 1 |
| 2021-03-15 01:29:02 | 1 |
| 2021-03-15 01:29:33 | 1 |
| 2021-03-15 01:30:04 | 1 |
| 2021-03-15 01:30:34 | 1 |
| 2021-03-15 01:31:05 | 1 |
| 2021-03-15 01:31:36 | 1 |
| 2021-03-15 01:32:06 | 1 |
| 2021-03-15 01:32:37 | 1 |
| 2021-03-15 01:33:08 | 1 |
| 2021-03-15 01:33:38 | 1 |
| 2021-03-15 01:34:09 | 1 |
| 2021-03-15 01:34:40 | 1 |
| 2021-03-15 01:35:11 | 1 |
| 2021-03-15 01:35:41 | 1 |
| 2021-03-15 01:36:12 | 1 |
| 2021-03-15 01:36:43 | 1 |
| 2021-03-15 01:37:13 | 1 |
| 2021-03-15 01:37:44 | 1 |
| 2021-03-15 01:38:15 | 1 |
| 2021-03-15 01:38:45 | 1 |
| 2021-03-15 01:39:16 | 1 |
| 2021-03-15 01:39:47 | 1 |
| 2021-03-15 01:40:17 | 1 |
| 2021-03-15 01:40:48 | 1 |
| 2021-03-15 01:41:19 | 1 |
| 2021-03-15 01:41:50 | 1 |
| 2021-03-15 01:42:20 | 1 |
| 2021-03-15 01:42:51 | 1 |
| 2021-03-15 01:43:22 | 1 |
| 2021-03-15 01:43:52 | 1 |
| 2021-03-15 01:44:23 | 1 |
| 2021-03-15 01:44:54 | 1 |
| 2021-03-15 01:45:24 | 1 |
| 2021-03-15 01:45:55 | 1 |
| 2021-03-15 01:46:26 | 1 |
| 2021-03-15 01:46:56 | 1 |
| 2021-03-15 01:47:27 | 1 |
| 2021-03-15 01:47:58 | 1 |
| 2021-03-15 01:48:29 | 1 |
| 2021-03-15 01:48:59 | 1 |
| 2021-03-15 01:49:30 | 1 |
| 2021-03-15 01:50:01 | 1 |
| 2021-03-15 01:50:31 | 1 |
| 2021-03-15 01:51:02 | 1 |
| 2021-03-15 01:51:33 | 1 |
| 2021-03-15 01:52:03 | 1 |
| 2021-03-15 01:52:34 | 1 |
| 2021-03-15 01:53:05 | 1 |
| 2021-03-15 01:53:35 | 1 |
| 2021-03-15 01:54:06 | 1 |
| 2021-03-15 01:54:37 | 1 |
| 2021-03-15 01:55:07 | 1 |
| 2021-03-15 01:55:38 | 1 |
| 2021-03-15 01:56:09 | 1 |
| 2021-03-15 01:56:39 | 1 |
| 2021-03-15 01:57:10 | 1 |
| 2021-03-15 01:57:41 | 1 |
| 2021-03-15 01:58:12 | 1 |
| 2021-03-15 01:58:42 | 1 |
| 2021-03-15 01:59:13 | 1 |
| 2021-03-15 01:59:44 | 1 |
| 2021-03-15 02:00:14 | 1 |
| 2021-03-15 02:00:45 | 1 |
| 2021-03-15 02:01:16 | 1 |
| 2021-03-15 02:01:46 | 1 |
| 2021-03-15 02:02:17 | 1 |
| 2021-03-15 02:02:48 | 1 |
| 2021-03-15 02:03:18 | 1 |
| 2021-03-15 02:03:49 | 1 |
| 2021-03-15 02:04:20 | 1 |
| 2021-03-15 02:04:51 | 1 |
| 2021-03-15 02:05:21 | 1 |
| 2021-03-15 02:05:52 | 1 |
| 2021-03-15 02:06:23 | 1 |
| 2021-03-15 02:06:53 | 1 |
| 2021-03-15 02:07:24 | 1 |
| 2021-03-15 02:07:55 | 1 |
| 2021-03-15 02:08:25 | 1 |
| 2021-03-15 02:08:56 | 1 |
| 2021-03-15 02:09:27 | 1 |
| 2021-03-15 02:09:57 | 1 |
| 2021-03-15 02:10:28 | 1 |
| 2021-03-15 02:10:59 | 1 |
| 2021-03-15 02:11:29 | 1 |
| 2021-03-15 02:12:00 | 1 |
| 2021-03-15 02:12:31 | 1 |
| 2021-03-15 02:13:02 | 1 |
| 2021-03-15 02:13:32 | 1 |
| 2021-03-15 02:14:03 | 1 |
| 2021-03-15 02:14:34 | 1 |
| 2021-03-15 02:15:04 | 1 |
| 2021-03-15 02:15:35 | 1 |
| 2021-03-15 02:16:06 | 1 |
| 2021-03-15 02:16:36 | 1 |
| 2021-03-15 02:17:07 | 1 |
| 2021-03-15 02:17:38 | 1 |
| 2021-03-15 02:18:08 | 1 |
| 2021-03-15 02:18:39 | 1 |
| 2021-03-15 02:19:10 | 1 |
| 2021-03-15 02:19:41 | 1 |
| 2021-03-15 02:20:11 | 1 |
| 2021-03-15 02:20:42 | 1 |
| 2021-03-15 02:21:13 | 1 |
| 2021-03-15 02:21:43 | 1 |
| 2021-03-15 02:22:14 | 1 |
| 2021-03-15 02:22:45 | 1 |
| 2021-03-15 02:23:15 | 1 |
| 2021-03-15 02:23:46 | 1 |
| 2021-03-15 02:24:17 | 1 |
| 2021-03-15 02:24:47 | 1 |
| 2021-03-15 02:25:18 | 1 |
| 2021-03-15 02:25:49 | 1 |
| 2021-03-15 02:26:19 | 1 |
| 2021-03-15 02:26:50 | 1 |
| 2021-03-15 02:27:21 | 1 |
| 2021-03-15 02:27:52 | 1 |
| 2021-03-15 02:28:22 | 1 |
| 2021-03-15 02:28:53 | 1 |
| 2021-03-15 02:29:24 | 1 |
| 2021-03-15 02:29:54 | 1 |
| 2021-03-15 02:30:25 | 1 |
| 2021-03-15 02:30:56 | 1 |
| 2021-03-15 02:31:26 | 1 |
| 2021-03-15 02:31:57 | 1 |
| 2021-03-15 02:32:28 | 1 |
| 2021-03-15 02:32:58 | 1 |
| 2021-03-15 02:33:29 | 1 |
| 2021-03-15 02:34:00 | 1 |
| 2021-03-15 02:34:31 | 1 |
| 2021-03-15 02:35:01 | 1 |
| 2021-03-15 02:35:32 | 1 |
| 2021-03-15 02:36:03 | 1 |
| 2021-03-15 02:36:33 | 1 |
| 2021-03-15 02:37:04 | 1 |
| 2021-03-15 02:37:35 | 1 |
| 2021-03-15 02:38:05 | 1 |
| 2021-03-15 02:38:36 | 1 |
| 2021-03-15 02:39:07 | 1 |
| 2021-03-15 02:39:37 | 1 |
| 2021-03-15 02:40:08 | 1 |
| 2021-03-15 02:40:39 | 1 |
| 2021-03-15 02:41:10 | 1 |
| 2021-03-15 02:41:40 | 1 |
| 2021-03-15 02:42:11 | 1 |
| 2021-03-15 02:42:42 | 1 |
| 2021-03-15 02:43:12 | 1 |
| 2021-03-15 02:43:43 | 1 |
| 2021-03-15 02:44:14 | 1 |
| 2021-03-15 02:44:44 | 1 |
| 2021-03-15 02:45:15 | 1 |
| 2021-03-15 02:45:46 | 1 |
| 2021-03-15 02:46:16 | 1 |
| 2021-03-15 02:46:47 | 1 |
| 2021-03-15 02:47:18 | 1 |
| 2021-03-15 02:47:49 | 1 |
| 2021-03-15 02:48:19 | 1 |
| 2021-03-15 02:48:50 | 1 |
| 2021-03-15 02:49:21 | 1 |
| 2021-03-15 02:49:51 | 1 |
| 2021-03-15 02:50:22 | 1 |
| 2021-03-15 02:50:53 | 1 |
| 2021-03-15 02:51:23 | 1 |
| 2021-03-15 02:51:54 | 1 |
| 2021-03-15 02:52:25 | 1 |
| 2021-03-15 02:52:55 | 1 |
| 2021-03-15 02:53:26 | 1 |
| 2021-03-15 02:53:57 | 1 |
| 2021-03-15 02:54:28 | 1 |
| 2021-03-15 02:54:58 | 1 |
| 2021-03-15 02:55:29 | 1 |
| 2021-03-15 02:56:00 | 1 |
| 2021-03-15 02:56:30 | 1 |
| 2021-03-15 02:57:01 | 1 |
| 2021-03-15 02:57:32 | 1 |
| 2021-03-15 02:58:02 | 1 |
| 2021-03-15 02:58:33 | 1 |
| 2021-03-15 02:59:04 | 1 |
| 2021-03-15 02:59:34 | 1 |
| 2021-03-15 03:00:05 | 1 |
| 2021-03-15 03:00:36 | 1 |
| 2021-03-15 03:01:07 | 1 |
| 2021-03-15 03:01:37 | 1 |
| 2021-03-15 03:02:08 | 1 |
| 2021-03-15 03:02:39 | 1 |
| 2021-03-15 03:03:09 | 1 |
| 2021-03-15 03:03:40 | 1 |
| 2021-03-15 03:04:11 | 1 |
| 2021-03-15 03:04:41 | 1 |
| 2021-03-15 03:05:12 | 1 |
| 2021-03-15 03:05:43 | 1 |
| 2021-03-15 03:06:13 | 1 |
| 2021-03-15 03:06:44 | 1 |
| 2021-03-15 03:07:15 | 1 |
| 2021-03-15 03:07:45 | 1 |
| 2021-03-15 03:08:16 | 1 |
| 2021-03-15 03:08:47 | 1 |
| 2021-03-15 03:09:18 | 1 |
| 2021-03-15 03:09:48 | 1 |
| 2021-03-15 03:10:19 | 1 |
| 2021-03-15 03:10:50 | 1 |
| 2021-03-15 03:11:20 | 1 |
| 2021-03-15 03:11:51 | 1 |
| 2021-03-15 03:12:22 | 1 |
| 2021-03-15 03:12:52 | 1 |
| 2021-03-15 03:13:23 | 1 |
| 2021-03-15 03:13:54 | 1 |
| 2021-03-15 03:14:24 | 1 |
| 2021-03-15 03:14:55 | 1 |
| 2021-03-15 03:15:26 | 1 |
| 2021-03-15 03:15:57 | 1 |
| 2021-03-15 03:16:27 | 1 |
| 2021-03-15 03:16:58 | 1 |
| 2021-03-15 03:17:29 | 1 |
| 2021-03-15 03:17:59 | 1 |
| 2021-03-15 03:18:30 | 1 |
| 2021-03-15 03:19:01 | 1 |
| 2021-03-15 03:19:31 | 1 |
| 2021-03-15 03:20:02 | 1 |
| 2021-03-15 03:20:33 | 1 |
| 2021-03-15 03:21:03 | 1 |
| 2021-03-15 03:21:34 | 1 |
| 2021-03-15 03:22:05 | 1 |
| 2021-03-15 03:22:36 | 1 |
| 2021-03-15 03:23:06 | 1 |
| 2021-03-15 03:23:37 | 1 |
| 2021-03-15 03:24:08 | 1 |
| 2021-03-15 03:24:38 | 1 |
| 2021-03-15 03:25:09 | 1 |
| 2021-03-15 03:25:40 | 1 |
| 2021-03-15 03:26:10 | 1 |
| 2021-03-15 03:26:41 | 1 |
| 2021-03-15 03:27:12 | 1 |
| 2021-03-15 03:27:42 | 1 |
| 2021-03-15 03:28:13 | 1 |
| 2021-03-15 03:28:44 | 1 |
| 2021-03-15 03:29:14 | 1 |
| 2021-03-15 03:29:45 | 1 |
| 2021-03-15 03:30:16 | 1 |
| 2021-03-15 03:30:47 | 1 |
| 2021-03-15 03:31:17 | 1 |
| 2021-03-15 03:31:48 | 1 |
| 2021-03-15 03:32:19 | 1 |
| 2021-03-15 03:32:49 | 1 |
| 2021-03-15 03:33:20 | 1 |
| 2021-03-15 03:33:51 | 1 |
| 2021-03-15 03:34:21 | 1 |
| 2021-03-15 03:34:52 | 1 |
| 2021-03-15 03:35:23 | 1 |
| 2021-03-15 03:35:53 | 1 |
| 2021-03-15 03:36:24 | 1 |
| 2021-03-15 03:36:55 | 1 |
| 2021-03-15 03:37:26 | 1 |
| 2021-03-15 03:37:56 | 1 |
| 2021-03-15 03:38:27 | 1 |
| 2021-03-15 03:38:58 | 1 |
| 2021-03-15 03:39:28 | 1 |
| 2021-03-15 03:39:59 | 1 |
| 2021-03-15 03:40:30 | 1 |
| 2021-03-15 03:41:00 | 1 |
| 2021-03-15 03:41:31 | 1 |
| 2021-03-15 03:42:02 | 1 |
| 2021-03-15 03:42:32 | 1 |
| 2021-03-15 03:43:03 | 1 |
| 2021-03-15 03:43:34 | 1 |
| 2021-03-15 03:44:05 | 1 |
| 2021-03-15 03:44:35 | 1 |
| 2021-03-15 03:45:06 | 1 |
| 2021-03-15 03:45:37 | 1 |
| 2021-03-15 03:46:07 | 1 |
| 2021-03-15 03:46:38 | 1 |
| 2021-03-15 03:47:09 | 1 |
| 2021-03-15 03:47:39 | 1 |
| 2021-03-15 03:48:10 | 1 |
| 2021-03-15 03:48:41 | 1 |
| 2021-03-15 03:49:11 | 1 |
| 2021-03-15 03:49:42 | 1 |
| 2021-03-15 03:50:13 | 1 |
| 2021-03-15 03:50:44 | 1 |
| 2021-03-15 03:51:14 | 1 |
| 2021-03-15 03:51:45 | 1 |
| 2021-03-15 03:52:16 | 1 |
| 2021-03-15 03:52:46 | 1 |
| 2021-03-15 03:53:17 | 1 |
| 2021-03-15 03:53:48 | 1 |
| 2021-03-15 03:54:18 | 1 |
| 2021-03-15 03:54:49 | 1 |
| 2021-03-15 03:55:20 | 1 |
| 2021-03-15 03:55:50 | 1 |
| 2021-03-15 03:56:21 | 1 |
| 2021-03-15 03:56:52 | 1 |
| 2021-03-15 03:57:23 | 1 |
| 2021-03-15 03:57:53 | 1 |
| 2021-03-15 03:58:24 | 1 |
| 2021-03-15 03:58:55 | 1 |
| 2021-03-15 03:59:25 | 1 |
| 2021-03-15 03:59:56 | 1 |
| 2021-03-15 04:00:27 | 1 |
| 2021-03-15 04:00:57 | 1 |
| 2021-03-15 04:01:28 | 1 |
| 2021-03-15 04:01:59 | 1 |
| 2021-03-15 04:02:29 | 1 |
| 2021-03-15 04:03:00 | 1 |
| 2021-03-15 04:03:31 | 1 |
| 2021-03-15 04:04:02 | 1 |
| 2021-03-15 04:04:32 | 1 |
| 2021-03-15 04:05:03 | 1 |
| 2021-03-15 04:05:34 | 1 |
| 2021-03-15 04:06:04 | 1 |
| 2021-03-15 04:06:35 | 1 |
| 2021-03-15 04:07:06 | 1 |
| 2021-03-15 04:07:36 | 1 |
| 2021-03-15 04:08:07 | 1 |
| 2021-03-15 04:08:38 | 1 |
| 2021-03-15 04:09:08 | 1 |
| 2021-03-15 04:09:39 | 1 |
| 2021-03-15 04:10:10 | 1 |
| 2021-03-15 04:10:41 | 1 |
| 2021-03-15 04:11:11 | 1 |
| 2021-03-15 04:11:42 | 1 |
| 2021-03-15 04:12:13 | 1 |
| 2021-03-15 04:12:43 | 1 |
| 2021-03-15 04:13:14 | 1 |
| 2021-03-15 04:13:45 | 1 |
| 2021-03-15 04:14:15 | 1 |
| 2021-03-15 04:14:46 | 1 |
| 2021-03-15 04:15:17 | 1 |
| 2021-03-15 04:15:47 | 1 |
| 2021-03-15 04:16:18 | 1 |
| 2021-03-15 04:16:49 | 1 |
| 2021-03-15 04:17:20 | 1 |
| 2021-03-15 04:17:50 | 1 |
| 2021-03-15 04:18:21 | 1 |
| 2021-03-15 04:18:52 | 1 |
| 2021-03-15 04:19:22 | 1 |
| 2021-03-15 04:19:53 | 1 |
| 2021-03-15 04:20:24 | 1 |
| 2021-03-15 04:20:54 | 1 |
| 2021-03-15 04:21:25 | 1 |
| 2021-03-15 04:21:56 | 1 |
| 2021-03-15 04:22:26 | 1 |
| 2021-03-15 04:22:57 | 1 |
| 2021-03-15 04:23:28 | 1 |
| 2021-03-15 04:23:59 | 1 |
| 2021-03-15 04:24:29 | 1 |
| 2021-03-15 04:25:00 | 1 |
| 2021-03-15 04:25:31 | 1 |
| 2021-03-15 04:26:01 | 1 |
| 2021-03-15 04:26:32 | 1 |
| 2021-03-15 04:27:03 | 1 |
| 2021-03-15 04:27:33 | 1 |
| 2021-03-15 04:28:04 | 1 |
| 2021-03-15 04:28:35 | 1 |
| 2021-03-15 04:29:05 | 1 |
| 2021-03-15 04:29:36 | 1 |
| 2021-03-15 04:30:07 | 1 |
| 2021-03-15 04:30:37 | 1 |
| 2021-03-15 04:31:08 | 1 |
| 2021-03-15 04:31:39 | 1 |
| 2021-03-15 04:32:10 | 1 |
| 2021-03-15 04:32:40 | 1 |
| 2021-03-15 04:33:11 | 1 |
| 2021-03-15 04:33:42 | 1 |
| 2021-03-15 04:34:12 | 1 |
| 2021-03-15 04:34:43 | 1 |
| 2021-03-15 04:35:14 | 1 |
| 2021-03-15 04:35:44 | 1 |
| 2021-03-15 04:36:15 | 1 |
| 2021-03-15 04:36:46 | 1 |
| 2021-03-15 04:37:16 | 1 |
| 2021-03-15 04:37:47 | 1 |
| 2021-03-15 04:38:18 | 1 |
| 2021-03-15 04:38:49 | 1 |
| 2021-03-15 04:39:19 | 1 |
| 2021-03-15 04:39:50 | 1 |
| 2021-03-15 04:40:21 | 1 |
| 2021-03-15 04:40:51 | 1 |
| 2021-03-15 04:41:22 | 1 |
| 2021-03-15 04:41:53 | 1 |
| 2021-03-15 04:42:23 | 1 |
| 2021-03-15 04:42:54 | 1 |
| 2021-03-15 04:43:25 | 1 |
| 2021-03-15 04:43:55 | 1 |
| 2021-03-15 04:44:26 | 1 |
| 2021-03-15 04:44:57 | 1 |
| 2021-03-15 04:45:28 | 1 |
| 2021-03-15 04:45:58 | 1 |
| 2021-03-15 04:46:29 | 1 |
| 2021-03-15 04:47:00 | 1 |
| 2021-03-15 04:47:30 | 1 |
| 2021-03-15 04:48:01 | 1 |
| 2021-03-15 04:48:32 | 1 |
| 2021-03-15 04:49:02 | 1 |
| 2021-03-15 04:49:33 | 1 |
| 2021-03-15 04:50:04 | 1 |
| 2021-03-15 04:50:34 | 1 |
| 2021-03-15 04:51:05 | 1 |
| 2021-03-15 04:51:36 | 1 |
| 2021-03-15 04:52:07 | 1 |
| 2021-03-15 04:52:37 | 1 |
| 2021-03-15 04:53:08 | 1 |
| 2021-03-15 04:53:39 | 1 |
| 2021-03-15 04:54:09 | 1 |
| 2021-03-15 04:54:40 | 1 |
| 2021-03-15 04:55:11 | 1 |
| 2021-03-15 04:55:41 | 1 |
| 2021-03-15 04:56:12 | 1 |
| 2021-03-15 04:56:43 | 1 |
| 2021-03-15 04:57:13 | 1 |
| 2021-03-15 04:57:44 | 1 |
| 2021-03-15 04:58:15 | 1 |
| 2021-03-15 04:58:46 | 1 |
| 2021-03-15 04:59:16 | 1 |
| 2021-03-15 04:59:47 | 1 |
| 2021-03-15 05:00:18 | 1 |
| 2021-03-15 05:00:48 | 1 |
| 2021-03-15 05:01:19 | 1 |
| 2021-03-15 05:01:50 | 1 |
| 2021-03-15 05:02:20 | 1 |
| 2021-03-15 05:02:51 | 1 |
| 2021-03-15 05:03:22 | 1 |
| 2021-03-15 05:03:52 | 1 |
| 2021-03-15 05:04:23 | 1 |
| 2021-03-15 05:04:54 | 1 |
| 2021-03-15 05:05:24 | 1 |
| 2021-03-15 05:05:55 | 1 |
| 2021-03-15 05:06:26 | 1 |
| 2021-03-15 05:06:57 | 1 |
| 2021-03-15 05:07:27 | 1 |
| 2021-03-15 05:07:58 | 1 |
| 2021-03-15 05:08:29 | 1 |
| 2021-03-15 05:08:59 | 1 |
| 2021-03-15 05:09:30 | 1 |
| 2021-03-15 05:10:01 | 1 |
| 2021-03-15 05:10:31 | 1 |
| 2021-03-15 05:11:02 | 1 |
| 2021-03-15 05:11:33 | 1 |
| 2021-03-15 05:12:03 | 1 |
| 2021-03-15 05:12:34 | 1 |
| 2021-03-15 05:13:05 | 1 |
| 2021-03-15 05:13:36 | 1 |
| 2021-03-15 05:14:06 | 1 |
| 2021-03-15 05:14:37 | 1 |
| 2021-03-15 05:15:08 | 1 |
| 2021-03-15 05:15:38 | 1 |
| 2021-03-15 05:16:09 | 1 |
| 2021-03-15 05:16:40 | 1 |
| 2021-03-15 05:17:10 | 1 |
| 2021-03-15 05:17:41 | 1 |
| 2021-03-15 05:18:12 | 1 |
| 2021-03-15 05:18:42 | 1 |
| 2021-03-15 05:19:13 | 1 |
| 2021-03-15 05:19:44 | 1 |
| 2021-03-15 05:20:15 | 1 |
| 2021-03-15 05:20:45 | 1 |
| 2021-03-15 05:21:16 | 1 |
| 2021-03-15 05:21:47 | 1 |
| 2021-03-15 05:22:17 | 1 |
| 2021-03-15 05:22:48 | 1 |
| 2021-03-15 05:23:19 | 1 |
| 2021-03-15 05:23:49 | 1 |
| 2021-03-15 05:24:20 | 1 |
| 2021-03-15 05:24:51 | 1 |
| 2021-03-15 05:25:21 | 1 |
| 2021-03-15 05:25:52 | 1 |
| 2021-03-15 05:26:23 | 1 |
| 2021-03-15 05:26:54 | 1 |
| 2021-03-15 05:27:24 | 1 |
| 2021-03-15 05:27:55 | 1 |
| 2021-03-15 05:28:26 | 1 |
| 2021-03-15 05:28:56 | 1 |
| 2021-03-15 05:29:27 | 1 |
| 2021-03-15 05:29:58 | 1 |
| 2021-03-15 05:30:28 | 1 |
| 2021-03-15 05:30:59 | 1 |
| 2021-03-15 05:31:30 | 1 |
| 2021-03-15 05:32:00 | 1 |
| 2021-03-15 05:32:31 | 1 |
| 2021-03-15 05:33:02 | 1 |
| 2021-03-15 05:33:33 | 1 |
| 2021-03-15 05:34:03 | 1 |
| 2021-03-15 05:34:34 | 1 |
| 2021-03-15 05:35:05 | 1 |
| 2021-03-15 05:35:35 | 1 |
| 2021-03-15 05:36:06 | 1 |
| 2021-03-15 05:36:37 | 1 |
| 2021-03-15 05:37:07 | 1 |
| 2021-03-15 05:37:38 | 1 |
| 2021-03-15 05:38:09 | 1 |
| 2021-03-15 05:38:39 | 1 |
| 2021-03-15 05:39:10 | 1 |
| 2021-03-15 05:39:41 | 1 |
| 2021-03-15 05:40:12 | 1 |
| 2021-03-15 05:40:42 | 1 |
| 2021-03-15 05:41:13 | 1 |
| 2021-03-15 05:41:44 | 1 |
| 2021-03-15 05:42:14 | 1 |
| 2021-03-15 05:42:45 | 1 |
| 2021-03-15 05:43:16 | 1 |
| 2021-03-15 05:43:46 | 1 |
| 2021-03-15 05:44:17 | 1 |
| 2021-03-15 05:44:48 | 1 |
| 2021-03-15 05:45:18 | 1 |
| 2021-03-15 05:45:49 | 1 |
| 2021-03-15 05:46:20 | 1 |
| 2021-03-15 05:46:50 | 1 |
| 2021-03-15 05:47:21 | 1 |
| 2021-03-15 05:47:52 | 1 |
| 2021-03-15 05:48:23 | 1 |
| 2021-03-15 05:48:53 | 1 |
| 2021-03-15 05:49:24 | 1 |
| 2021-03-15 05:49:55 | 1 |
| 2021-03-15 05:50:25 | 1 |
| 2021-03-15 05:50:56 | 1 |
| 2021-03-15 05:51:27 | 1 |
| 2021-03-15 05:51:57 | 1 |
| 2021-03-15 05:52:28 | 1 |
| 2021-03-15 05:52:59 | 1 |
| 2021-03-15 05:53:29 | 1 |
| 2021-03-15 05:54:00 | 1 |
| 2021-03-15 05:54:31 | 1 |
| 2021-03-15 05:55:02 | 1 |
| 2021-03-15 05:55:32 | 1 |
| 2021-03-15 05:56:03 | 1 |
| 2021-03-15 05:56:34 | 1 |
| 2021-03-15 05:57:04 | 1 |
| 2021-03-15 05:57:35 | 1 |
| 2021-03-15 05:58:06 | 1 |
| 2021-03-15 05:58:36 | 1 |
| 2021-03-15 05:59:07 | 1 |
| 2021-03-15 05:59:38 | 1 |
| 2021-03-15 06:00:08 | 1 |
| 2021-03-15 06:00:39 | 1 |
| 2021-03-15 06:01:10 | 1 |
| 2021-03-15 06:01:41 | 1 |
| 2021-03-15 06:02:11 | 1 |
| 2021-03-15 06:02:42 | 1 |
| 2021-03-15 06:03:13 | 1 |
| 2021-03-15 06:03:43 | 1 |
| 2021-03-15 06:04:14 | 1 |
| 2021-03-15 06:04:45 | 1 |
| 2021-03-15 06:05:15 | 1 |
| 2021-03-15 06:05:46 | 1 |
| 2021-03-15 06:06:17 | 1 |
| 2021-03-15 06:06:47 | 1 |
| 2021-03-15 06:07:18 | 1 |
| 2021-03-15 06:07:49 | 1 |
| 2021-03-15 06:08:20 | 1 |
| 2021-03-15 06:08:50 | 1 |
| 2021-03-15 06:09:21 | 1 |
| 2021-03-15 06:09:52 | 1 |
| 2021-03-15 06:10:22 | 1 |
| 2021-03-15 06:10:53 | 1 |
| 2021-03-15 06:11:24 | 1 |
| 2021-03-15 06:11:54 | 1 |
| 2021-03-15 06:12:25 | 1 |
| 2021-03-15 06:12:56 | 1 |
| 2021-03-15 06:13:26 | 1 |
| 2021-03-15 06:13:57 | 1 |
| 2021-03-15 06:14:28 | 1 |
| 2021-03-15 06:14:59 | 1 |
| 2021-03-15 06:15:29 | 1 |
| 2021-03-15 06:16:00 | 1 |
| 2021-03-15 06:16:31 | 1 |
| 2021-03-15 06:17:01 | 1 |
| 2021-03-15 06:17:32 | 1 |
| 2021-03-15 06:18:03 | 1 |
| 2021-03-15 06:18:33 | 1 |
| 2021-03-15 06:19:04 | 1 |
| 2021-03-15 06:19:35 | 1 |
| 2021-03-15 06:20:05 | 1 |
| 2021-03-15 06:20:36 | 1 |
| 2021-03-15 06:21:07 | 1 |
| 2021-03-15 06:21:38 | 1 |
| 2021-03-15 06:22:08 | 1 |
| 2021-03-15 06:22:39 | 1 |
| 2021-03-15 06:23:10 | 1 |
| 2021-03-15 06:23:40 | 1 |
| 2021-03-15 06:24:11 | 1 |
| 2021-03-15 06:24:42 | 1 |
| 2021-03-15 06:25:12 | 1 |
| 2021-03-15 06:25:43 | 1 |
| 2021-03-15 06:26:14 | 1 |
| 2021-03-15 06:26:44 | 1 |
| 2021-03-15 06:27:15 | 1 |
| 2021-03-15 06:27:46 | 1 |
| 2021-03-15 06:28:17 | 1 |
| 2021-03-15 06:28:47 | 1 |
| 2021-03-15 06:29:18 | 1 |
| 2021-03-15 06:29:49 | 1 |
| 2021-03-15 06:30:19 | 1 |
| 2021-03-15 06:30:50 | 1 |
| 2021-03-15 06:31:21 | 1 |
| 2021-03-15 06:31:51 | 1 |
| 2021-03-15 06:32:22 | 1 |
| 2021-03-15 06:32:53 | 1 |
| 2021-03-15 06:33:23 | 1 |
| 2021-03-15 06:33:54 | 1 |
| 2021-03-15 06:34:25 | 1 |
| 2021-03-15 06:34:56 | 1 |
| 2021-03-15 06:35:26 | 1 |
| 2021-03-15 06:35:57 | 1 |
| 2021-03-15 06:36:28 | 1 |
| 2021-03-15 06:36:58 | 1 |
| 2021-03-15 06:37:29 | 1 |
| 2021-03-15 06:38:00 | 1 |
| 2021-03-15 06:38:30 | 1 |
| 2021-03-15 06:39:01 | 1 |
| 2021-03-15 06:39:32 | 1 |
| 2021-03-15 06:40:02 | 1 |
| 2021-03-15 06:40:33 | 1 |
| 2021-03-15 06:41:04 | 1 |
| 2021-03-15 06:41:35 | 1 |
| 2021-03-15 06:42:05 | 1 |
| 2021-03-15 06:42:36 | 1 |
| 2021-03-15 06:43:07 | 1 |
| 2021-03-15 06:43:37 | 1 |
| 2021-03-15 06:44:08 | 1 |
| 2021-03-15 06:44:39 | 1 |
| 2021-03-15 06:45:09 | 1 |
| 2021-03-15 06:45:40 | 1 |
| 2021-03-15 06:46:11 | 1 |
| 2021-03-15 06:46:41 | 1 |
| 2021-03-15 06:47:12 | 1 |
| 2021-03-15 06:47:43 | 1 |
| 2021-03-15 06:48:14 | 1 |
| 2021-03-15 06:48:44 | 1 |
| 2021-03-15 06:49:15 | 1 |
| 2021-03-15 06:49:46 | 1 |
| 2021-03-15 06:50:16 | 1 |
| 2021-03-15 06:50:47 | 1 |
| 2021-03-15 06:51:18 | 1 |
| 2021-03-15 06:51:48 | 1 |
| 2021-03-15 06:52:19 | 1 |
| 2021-03-15 06:52:50 | 1 |
| 2021-03-15 06:53:21 | 1 |
| 2021-03-15 06:53:51 | 1 |
| 2021-03-15 06:54:22 | 1 |
| 2021-03-15 06:54:53 | 1 |
| 2021-03-15 06:55:23 | 1 |
| 2021-03-15 06:55:54 | 1 |
| 2021-03-15 06:56:25 | 1 |
| 2021-03-15 06:56:55 | 1 |
| 2021-03-15 06:57:26 | 1 |
| 2021-03-15 06:57:57 | 1 |
| 2021-03-15 06:58:27 | 1 |
| 2021-03-15 06:58:58 | 1 |
| 2021-03-15 06:59:29 | 1 |
| 2021-03-15 07:00:00 | 1 |
| 2021-03-15 07:00:30 | 1 |
| 2021-03-15 07:01:01 | 1 |
| 2021-03-15 07:01:32 | 1 |
| 2021-03-15 07:02:02 | 1 |
| 2021-03-15 07:02:33 | 1 |
| 2021-03-15 07:03:04 | 1 |
| 2021-03-15 07:03:34 | 1 |
| 2021-03-15 07:04:05 | 1 |
| 2021-03-15 07:04:36 | 1 |
| 2021-03-15 07:05:06 | 1 |
| 2021-03-15 07:05:37 | 1 |
| 2021-03-15 07:06:08 | 1 |
| 2021-03-15 07:06:39 | 1 |
| 2021-03-15 07:07:09 | 1 |
| 2021-03-15 07:07:40 | 1 |
| 2021-03-15 07:08:11 | 1 |
| 2021-03-15 07:08:41 | 1 |
| 2021-03-15 07:09:12 | 1 |
| 2021-03-15 07:09:43 | 1 |
| 2021-03-15 07:10:13 | 1 |
| 2021-03-15 07:10:44 | 1 |
| 2021-03-15 07:11:15 | 1 |
| 2021-03-15 07:11:46 | 1 |
| 2021-03-15 07:12:16 | 1 |
| 2021-03-15 07:12:47 | 1 |
| 2021-03-15 07:13:18 | 1 |
| 2021-03-15 07:13:48 | 1 |
| 2021-03-15 07:14:19 | 1 |
| 2021-03-15 07:14:50 | 1 |
| 2021-03-15 07:15:20 | 1 |
| 2021-03-15 07:15:51 | 1 |
| 2021-03-15 07:16:22 | 1 |
| 2021-03-15 07:16:52 | 1 |
| 2021-03-15 07:17:23 | 1 |
| 2021-03-15 07:17:54 | 1 |
| 2021-03-15 07:18:25 | 1 |
| 2021-03-15 07:18:55 | 1 |
| 2021-03-15 07:19:26 | 1 |
| 2021-03-15 07:19:57 | 1 |
| 2021-03-15 07:20:27 | 1 |
| 2021-03-15 07:20:58 | 1 |
| 2021-03-15 07:21:29 | 1 |
| 2021-03-15 07:21:59 | 1 |
| 2021-03-15 07:22:30 | 1 |
| 2021-03-15 07:23:01 | 1 |
| 2021-03-15 07:23:31 | 1 |
| 2021-03-15 07:24:02 | 1 |
| 2021-03-15 07:24:33 | 1 |
| 2021-03-15 07:25:04 | 1 |
| 2021-03-15 07:25:34 | 1 |
| 2021-03-15 07:26:05 | 1 |
| 2021-03-15 07:26:36 | 1 |
| 2021-03-15 07:27:06 | 1 |
| 2021-03-15 07:27:37 | 1 |
| 2021-03-15 07:28:08 | 1 |
| 2021-03-15 07:28:38 | 1 |
| 2021-03-15 07:29:09 | 1 |
| 2021-03-15 07:29:40 | 1 |
| 2021-03-15 07:30:10 | 1 |
| 2021-03-15 07:30:41 | 1 |
| 2021-03-15 07:31:12 | 1 |
| 2021-03-15 07:31:43 | 1 |
| 2021-03-15 07:32:13 | 1 |
| 2021-03-15 07:32:44 | 1 |
| 2021-03-15 07:33:15 | 1 |
| 2021-03-15 07:33:45 | 1 |
| 2021-03-15 07:34:16 | 1 |
| 2021-03-15 07:34:47 | 1 |
| 2021-03-15 07:35:17 | 1 |
| 2021-03-15 07:35:48 | 1 |
| 2021-03-15 07:36:19 | 1 |
| 2021-03-15 07:36:50 | 1 |
| 2021-03-15 07:37:20 | 1 |
| 2021-03-15 07:37:51 | 1 |
| 2021-03-15 07:38:22 | 1 |
| 2021-03-15 07:38:52 | 1 |
| 2021-03-15 07:39:23 | 1 |
| 2021-03-15 07:39:54 | 1 |
| 2021-03-15 07:40:24 | 1 |
| 2021-03-15 07:40:55 | 1 |
| 2021-03-15 07:41:26 | 1 |
| 2021-03-15 07:41:56 | 1 |
| 2021-03-15 07:42:27 | 1 |
| 2021-03-15 07:42:58 | 1 |
| 2021-03-15 07:43:29 | 1 |
| 2021-03-15 07:43:59 | 1 |
| 2021-03-15 07:44:30 | 1 |
| 2021-03-15 07:45:01 | 1 |
| 2021-03-15 07:45:31 | 1 |
| 2021-03-15 07:46:02 | 1 |
| 2021-03-15 07:46:33 | 1 |
| 2021-03-15 07:47:03 | 1 |
| 2021-03-15 07:47:34 | 1 |
| 2021-03-15 07:48:05 | 1 |
| 2021-03-15 07:48:35 | 1 |
| 2021-03-15 07:49:06 | 1 |
| 2021-03-15 07:49:37 | 1 |
| 2021-03-15 07:50:08 | 1 |
| 2021-03-15 07:50:38 | 1 |
| 2021-03-15 07:51:09 | 1 |
| 2021-03-15 07:51:40 | 1 |
| 2021-03-15 07:52:10 | 1 |
| 2021-03-15 07:52:41 | 1 |
| 2021-03-15 07:53:12 | 1 |
| 2021-03-15 07:53:42 | 1 |
| 2021-03-15 07:54:13 | 1 |
| 2021-03-15 07:54:44 | 1 |
| 2021-03-15 07:55:14 | 1 |
| 2021-03-15 07:55:45 | 1 |
| 2021-03-15 07:56:16 | 1 |
| 2021-03-15 07:56:47 | 1 |
| 2021-03-15 07:57:17 | 1 |
| 2021-03-15 07:57:48 | 1 |
| 2021-03-15 07:58:19 | 1 |
| 2021-03-15 07:58:49 | 1 |
| 2021-03-15 07:59:20 | 1 |
| 2021-03-15 07:59:51 | 1 |